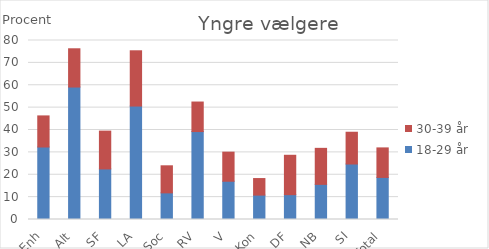
| Category | 18-29 år | 30-39 år |
|---|---|---|
| Enh | 32.4 | 13.9 |
| Alt | 59.2 | 17.1 |
| SF | 22.6 | 16.9 |
| LA | 50.7 | 24.7 |
| Soc | 11.9 | 12.1 |
| RV | 39.3 | 13.2 |
| V | 17.1 | 13 |
| Kon | 10.9 | 7.4 |
| DF | 11.1 | 17.6 |
| NB | 15.7 | 16.1 |
| SI | 24.8 | 14.2 |
| Total | 18.8 | 13.2 |